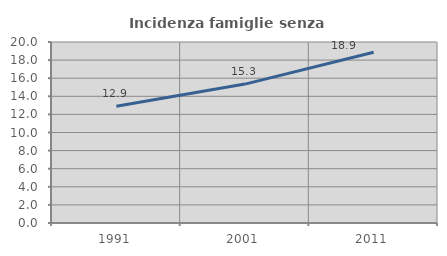
| Category | Incidenza famiglie senza nuclei |
|---|---|
| 1991.0 | 12.909 |
| 2001.0 | 15.35 |
| 2011.0 | 18.859 |